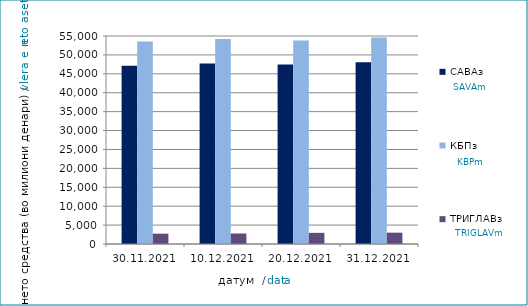
| Category | САВАз | КБПз | ТРИГЛАВз |
|---|---|---|---|
| 2021-11-30 | 47154.364 | 53571.871 | 2729.429 |
| 2021-12-10 | 47702.564 | 54233.813 | 2774.832 |
| 2021-12-20 | 47439.521 | 53784.773 | 2949.262 |
| 2021-12-31 | 48059.628 | 54605.42 | 2996.679 |